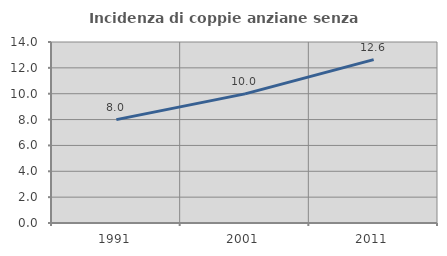
| Category | Incidenza di coppie anziane senza figli  |
|---|---|
| 1991.0 | 7.997 |
| 2001.0 | 9.986 |
| 2011.0 | 12.636 |